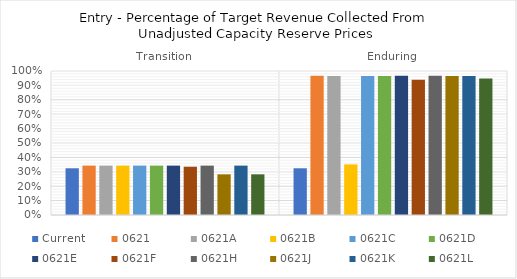
| Category | Current | 0621 | 0621A | 0621B | 0621C | 0621D | 0621E | 0621F | 0621H | 0621J | 0621K | 0621L |
|---|---|---|---|---|---|---|---|---|---|---|---|---|
| Transition | 0.324 | 0.343 | 0.343 | 0.343 | 0.343 | 0.343 | 0.343 | 0.335 | 0.343 | 0.282 | 0.343 | 0.282 |
| Enduring | 0.324 | 0.967 | 0.965 | 0.351 | 0.965 | 0.965 | 0.967 | 0.939 | 0.967 | 0.965 | 0.965 | 0.948 |